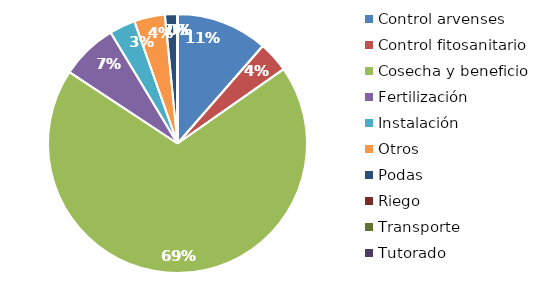
| Category | Valor |
|---|---|
| Control arvenses | 6860000 |
| Control fitosanitario | 2304000 |
| Cosecha y beneficio | 41421500 |
| Fertilización | 4248000 |
| Instalación | 1944000 |
| Otros | 2304000 |
| Podas | 936000 |
| Riego | 0 |
| Transporte | 0 |
| Tutorado | 0 |